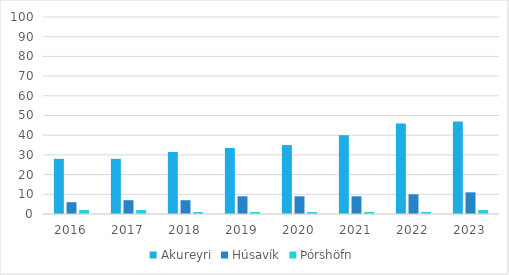
| Category | Akureyri | Húsavík | Þórshöfn |
|---|---|---|---|
| 2016 | 28 | 6 | 2 |
| 2017 | 28 | 7 | 2 |
| 2018 | 31.5 | 7 | 1 |
| 2019 | 33.5 | 9 | 1 |
| 2020 | 35 | 9 | 1 |
| 2021 | 40 | 9 | 1 |
| 2022 | 46 | 10 | 1 |
| 2023 | 47 | 11 | 2 |